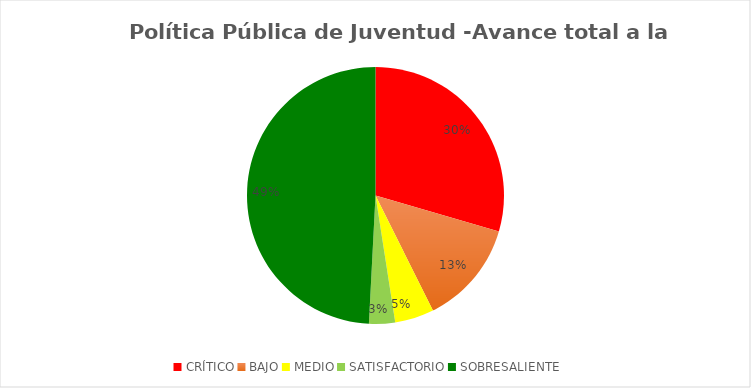
| Category | Series 0 |
|---|---|
| CRÍTICO | 18 |
| BAJO | 8 |
| MEDIO | 3 |
| SATISFACTORIO | 2 |
| SOBRESALIENTE | 30 |